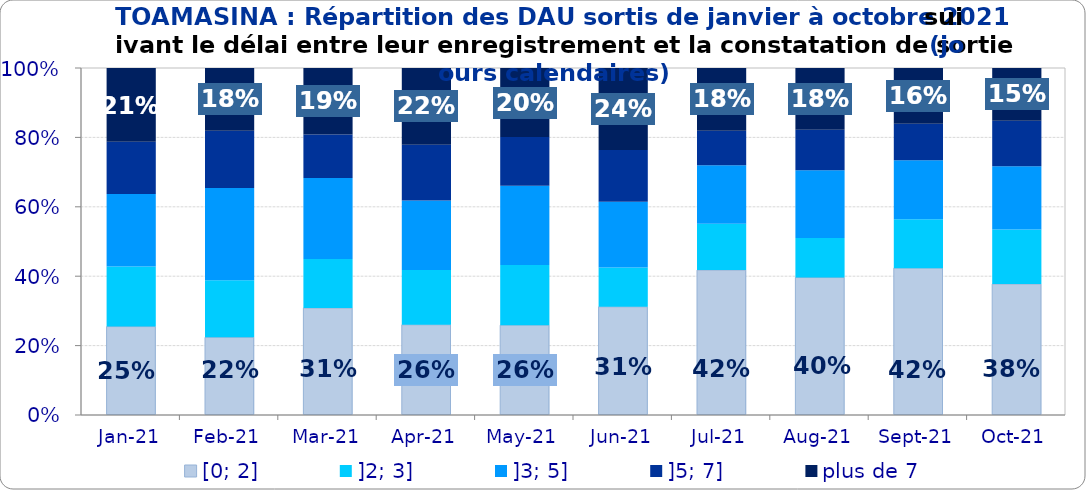
| Category | [0; 2] | ]2; 3] | ]3; 5] | ]5; 7] | plus de 7 |
|---|---|---|---|---|---|
| 2021-01-01 | 0.255 | 0.173 | 0.209 | 0.15 | 0.213 |
| 2021-02-01 | 0.224 | 0.164 | 0.266 | 0.165 | 0.181 |
| 2021-03-01 | 0.308 | 0.141 | 0.233 | 0.125 | 0.192 |
| 2021-04-01 | 0.26 | 0.158 | 0.201 | 0.16 | 0.221 |
| 2021-05-01 | 0.259 | 0.173 | 0.229 | 0.14 | 0.199 |
| 2021-06-01 | 0.312 | 0.113 | 0.19 | 0.149 | 0.236 |
| 2021-07-01 | 0.418 | 0.133 | 0.169 | 0.099 | 0.181 |
| 2021-08-01 | 0.396 | 0.114 | 0.195 | 0.117 | 0.178 |
| 2021-09-01 | 0.423 | 0.141 | 0.17 | 0.105 | 0.161 |
| 2021-10-01 | 0.377 | 0.157 | 0.183 | 0.131 | 0.152 |